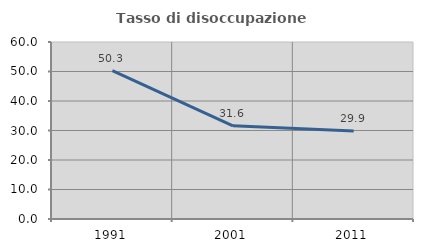
| Category | Tasso di disoccupazione giovanile  |
|---|---|
| 1991.0 | 50.303 |
| 2001.0 | 31.6 |
| 2011.0 | 29.872 |